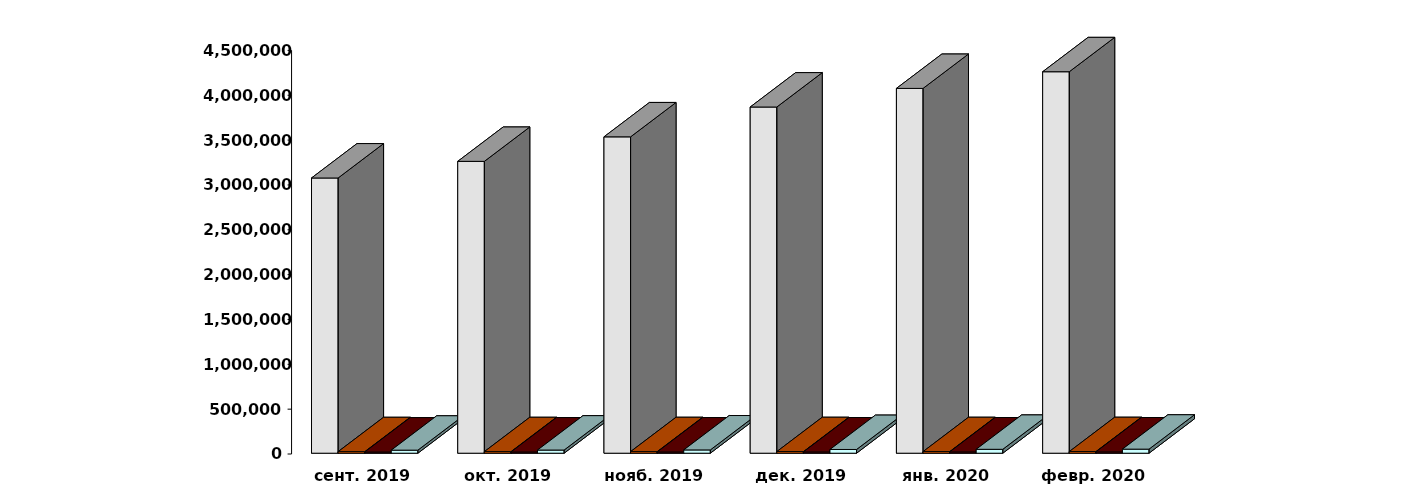
| Category | Физические лица | Юридические лица | Иностранные лица | Клиенты, передавшие свои средства в ДУ |
|---|---|---|---|---|
| 2019-09-29 | 3068547 | 17183 | 13213 | 33842 |
| 2019-10-29 | 3253953 | 17389 | 13455 | 35116 |
| 2019-11-29 | 3527188 | 17527 | 13688 | 36567 |
| 2019-12-29 | 3859911 | 17695 | 14011 | 41535 |
| 2020-01-29 | 4067317 | 17706 | 14182 | 43400 |
| 2020-02-29 | 4253153 | 17783 | 14404 | 45201 |